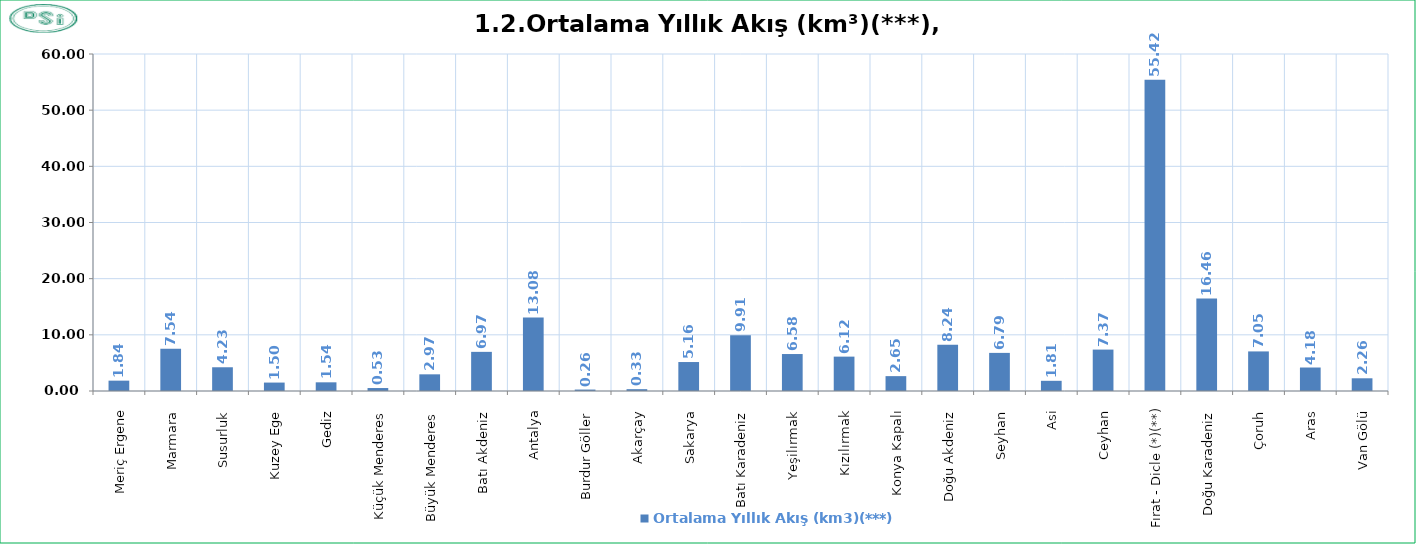
| Category | Ortalama Yıllık Akış (km3)(***) |
|---|---|
| Meriç Ergene | 1.842 |
| Marmara  | 7.54 |
| Susurluk  | 4.226 |
| Kuzey Ege  | 1.501 |
| Gediz  | 1.545 |
| Küçük Menderes  | 0.528 |
| Büyük Menderes  | 2.969 |
| Batı Akdeniz  | 6.969 |
| Antalya  | 13.083 |
| Burdur Göller  | 0.256 |
| Akarçay  | 0.326 |
| Sakarya  | 5.158 |
| Batı Karadeniz  | 9.914 |
| Yeşilırmak  | 6.582 |
| Kızılırmak  | 6.12 |
| Konya Kapalı  | 2.647 |
| Doğu Akdeniz  | 8.24 |
| Seyhan  | 6.786 |
| Asi  | 1.813 |
| Ceyhan  | 7.371 |
| Fırat - Dicle (*)(**) | 55.419 |
| Doğu Karadeniz  | 16.461 |
| Çoruh  | 7.047 |
| Aras  | 4.182 |
| Van Gölü  | 2.263 |